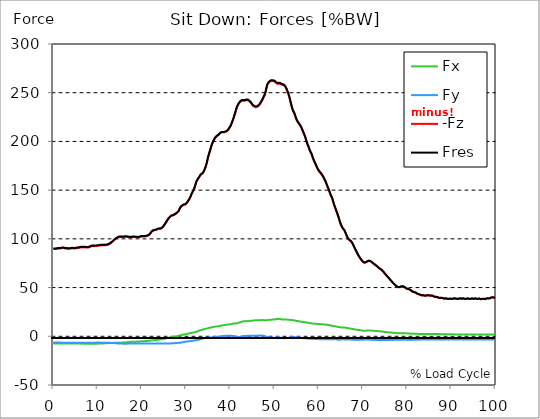
| Category |  Fx |  Fy |  -Fz |  Fres |
|---|---|---|---|---|
| 0.0 | -7.379 | -6.45 | 89.484 | 90.032 |
| 0.167348456675344 | -7.395 | -6.447 | 89.5 | 90.05 |
| 0.334696913350688 | -7.417 | -6.444 | 89.541 | 90.093 |
| 0.5020453700260321 | -7.413 | -6.454 | 89.602 | 90.153 |
| 0.669393826701376 | -7.375 | -6.476 | 89.627 | 90.177 |
| 0.83674228337672 | -7.375 | -6.463 | 89.794 | 90.341 |
| 1.0040907400520642 | -7.398 | -6.44 | 90.047 | 90.593 |
| 1.1621420602454444 | -7.417 | -6.447 | 90.121 | 90.668 |
| 1.3294905169207885 | -7.434 | -6.459 | 90.168 | 90.718 |
| 1.4968389735961325 | -7.412 | -6.487 | 90.153 | 90.704 |
| 1.6641874302714765 | -7.404 | -6.516 | 90.204 | 90.755 |
| 1.8315358869468206 | -7.42 | -6.537 | 90.339 | 90.894 |
| 1.9988843436221646 | -7.459 | -6.546 | 90.487 | 91.043 |
| 2.1662328002975086 | -7.471 | -6.546 | 90.535 | 91.093 |
| 2.333581256972853 | -7.472 | -6.556 | 90.541 | 91.099 |
| 2.5009297136481967 | -7.513 | -6.55 | 90.437 | 90.997 |
| 2.6682781703235405 | -7.469 | -6.583 | 90.109 | 90.67 |
| 2.8356266269988843 | -7.404 | -6.563 | 90.09 | 90.645 |
| 3.002975083674229 | -7.412 | -6.534 | 90.072 | 90.625 |
| 3.1703235403495724 | -7.416 | -6.546 | 89.855 | 90.412 |
| 3.337671997024917 | -7.341 | -6.555 | 89.761 | 90.313 |
| 3.4957233172182973 | -7.307 | -6.552 | 89.792 | 90.339 |
| 3.663071773893641 | -7.299 | -6.544 | 89.86 | 90.406 |
| 3.8304202305689854 | -7.304 | -6.54 | 89.978 | 90.524 |
| 3.997768687244329 | -7.348 | -6.54 | 90.205 | 90.752 |
| 4.165117143919673 | -7.417 | -6.54 | 90.24 | 90.792 |
| 4.332465600595017 | -7.419 | -6.571 | 90.252 | 90.807 |
| 4.499814057270361 | -7.442 | -6.578 | 90.277 | 90.833 |
| 4.667162513945706 | -7.442 | -6.583 | 90.119 | 90.678 |
| 4.834510970621049 | -7.401 | -6.597 | 89.976 | 90.534 |
| 5.001859427296393 | -7.375 | -6.584 | 90.155 | 90.708 |
| 5.169207883971737 | -7.426 | -6.547 | 90.428 | 90.979 |
| 5.336556340647081 | -7.481 | -6.538 | 90.6 | 91.156 |
| 5.503904797322425 | -7.541 | -6.568 | 90.63 | 91.192 |
| 5.671253253997769 | -7.501 | -6.583 | 90.667 | 91.226 |
| 5.82930457419115 | -7.494 | -6.586 | 90.838 | 91.395 |
| 5.996653030866494 | -7.519 | -6.583 | 91.06 | 91.618 |
| 6.164001487541838 | -7.55 | -6.572 | 91.251 | 91.81 |
| 6.331349944217181 | -7.575 | -6.572 | 91.353 | 91.913 |
| 6.498698400892526 | -7.553 | -6.596 | 91.317 | 91.878 |
| 6.66604685756787 | -7.488 | -6.643 | 91.158 | 91.718 |
| 6.833395314243213 | -7.457 | -6.642 | 91.326 | 91.882 |
| 7.000743770918558 | -7.575 | -6.628 | 91.412 | 91.976 |
| 7.168092227593902 | -7.615 | -6.621 | 91.24 | 91.808 |
| 7.335440684269246 | -7.6 | -6.619 | 91.078 | 91.647 |
| 7.50278914094459 | -7.547 | -6.611 | 90.984 | 91.547 |
| 7.6701375976199335 | -7.574 | -6.584 | 90.999 | 91.56 |
| 7.837486054295278 | -7.591 | -6.606 | 91.052 | 91.617 |
| 7.995537374488658 | -7.609 | -6.614 | 91.264 | 91.83 |
| 8.162885831164003 | -7.714 | -6.59 | 91.594 | 92.165 |
| 8.330234287839346 | -7.729 | -6.587 | 91.844 | 92.414 |
| 8.49758274451469 | -7.718 | -6.569 | 92.087 | 92.655 |
| 8.664931201190035 | -7.701 | -6.529 | 92.574 | 93.134 |
| 8.832279657865378 | -7.676 | -6.529 | 92.658 | 93.214 |
| 8.999628114540721 | -7.59 | -6.519 | 92.678 | 93.229 |
| 9.166976571216066 | -7.643 | -6.509 | 92.774 | 93.327 |
| 9.334325027891412 | -7.606 | -6.516 | 92.656 | 93.208 |
| 9.501673484566755 | -7.553 | -6.515 | 92.659 | 93.206 |
| 9.669021941242098 | -7.531 | -6.509 | 92.739 | 93.285 |
| 9.836370397917442 | -7.628 | -6.454 | 93.004 | 93.553 |
| 10.003718854592787 | -7.569 | -6.484 | 92.82 | 93.367 |
| 10.17106731126813 | -7.519 | -6.471 | 92.92 | 93.463 |
| 10.329118631461512 | -7.497 | -6.473 | 93.072 | 93.612 |
| 10.496467088136853 | -7.549 | -6.485 | 93.274 | 93.82 |
| 10.663815544812199 | -7.485 | -6.525 | 93.298 | 93.842 |
| 10.831164001487544 | -7.493 | -6.56 | 93.469 | 94.016 |
| 10.998512458162887 | -7.506 | -6.577 | 93.524 | 94.074 |
| 11.16586091483823 | -7.412 | -6.581 | 93.552 | 94.093 |
| 11.333209371513574 | -7.338 | -6.594 | 93.429 | 93.968 |
| 11.50055782818892 | -7.214 | -6.593 | 93.422 | 93.953 |
| 11.667906284864264 | -7.136 | -6.591 | 93.426 | 93.951 |
| 11.835254741539607 | -7.068 | -6.6 | 93.407 | 93.928 |
| 12.00260319821495 | -7.058 | -6.622 | 93.622 | 94.146 |
| 12.169951654890292 | -6.996 | -6.656 | 93.752 | 94.271 |
| 12.337300111565641 | -7.049 | -6.671 | 94.016 | 94.54 |
| 12.504648568240984 | -6.941 | -6.709 | 94.137 | 94.656 |
| 12.662699888434362 | -6.909 | -6.737 | 94.591 | 95.109 |
| 12.830048345109708 | -6.873 | -6.774 | 95.115 | 95.633 |
| 12.997396801785053 | -6.801 | -6.795 | 95.795 | 96.308 |
| 13.164745258460396 | -6.798 | -6.801 | 96.435 | 96.948 |
| 13.33209371513574 | -6.761 | -6.847 | 96.898 | 97.413 |
| 13.499442171811083 | -6.749 | -6.891 | 97.558 | 98.074 |
| 13.666790628486426 | -6.786 | -6.94 | 98.419 | 98.94 |
| 13.834139085161771 | -6.763 | -7.003 | 99.14 | 99.662 |
| 14.001487541837117 | -6.723 | -7.037 | 99.699 | 100.221 |
| 14.16883599851246 | -6.715 | -7.114 | 100.147 | 100.671 |
| 14.336184455187803 | -6.68 | -7.235 | 100.509 | 101.034 |
| 14.503532911863147 | -6.646 | -7.344 | 101.016 | 101.543 |
| 14.670881368538492 | -6.608 | -7.445 | 101.558 | 102.087 |
| 14.828932688731873 | -6.58 | -7.472 | 101.853 | 102.381 |
| 14.996281145407215 | -6.544 | -7.497 | 101.872 | 102.398 |
| 15.163629602082558 | -6.485 | -7.496 | 101.87 | 102.392 |
| 15.330978058757903 | -6.538 | -7.494 | 101.948 | 102.475 |
| 15.498326515433247 | -6.531 | -7.5 | 101.944 | 102.472 |
| 15.665674972108594 | -6.465 | -7.531 | 101.907 | 102.434 |
| 15.833023428783937 | -6.4 | -7.568 | 101.914 | 102.44 |
| 16.00037188545928 | -6.322 | -7.581 | 101.928 | 102.448 |
| 16.167720342134626 | -6.295 | -7.597 | 102.119 | 102.639 |
| 16.335068798809967 | -6.302 | -7.577 | 102.273 | 102.789 |
| 16.502417255485312 | -6.198 | -7.563 | 102.187 | 102.696 |
| 16.669765712160658 | -6.078 | -7.541 | 102.058 | 102.558 |
| 16.837114168836 | -5.938 | -7.501 | 101.861 | 102.353 |
| 17.004462625511344 | -5.851 | -7.476 | 101.704 | 102.189 |
| 17.16251394570472 | -5.767 | -7.451 | 101.566 | 102.047 |
| 17.32986240238007 | -5.696 | -7.406 | 101.69 | 102.165 |
| 17.497210859055414 | -5.661 | -7.385 | 101.686 | 102.161 |
| 17.664559315730756 | -5.619 | -7.386 | 101.674 | 102.146 |
| 17.8319077724061 | -5.649 | -7.388 | 101.866 | 102.341 |
| 17.999256229081443 | -5.624 | -7.383 | 101.934 | 102.407 |
| 18.166604685756788 | -5.597 | -7.363 | 101.932 | 102.404 |
| 18.333953142432133 | -5.522 | -7.369 | 101.867 | 102.336 |
| 18.501301599107478 | -5.482 | -7.391 | 101.881 | 102.348 |
| 18.668650055782823 | -5.504 | -7.373 | 101.779 | 102.249 |
| 18.835998512458165 | -5.442 | -7.392 | 101.571 | 102.04 |
| 19.00334696913351 | -5.42 | -7.385 | 101.518 | 101.985 |
| 19.170695425808855 | -5.4 | -7.375 | 101.482 | 101.948 |
| 19.338043882484197 | -5.333 | -7.336 | 101.647 | 102.108 |
| 19.496095202677576 | -5.302 | -7.294 | 101.912 | 102.367 |
| 19.66344365935292 | -5.268 | -7.285 | 102.145 | 102.599 |
| 19.830792116028263 | -5.18 | -7.363 | 102.195 | 102.649 |
| 19.998140572703612 | -5.159 | -7.397 | 102.401 | 102.854 |
| 20.165489029378953 | -5.124 | -7.381 | 102.558 | 103.009 |
| 20.3328374860543 | -5.093 | -7.369 | 102.524 | 102.972 |
| 20.500185942729644 | -5.034 | -7.355 | 102.471 | 102.916 |
| 20.667534399404985 | -4.941 | -7.336 | 102.504 | 102.942 |
| 20.83488285608033 | -4.863 | -7.33 | 102.751 | 103.186 |
| 21.002231312755672 | -4.82 | -7.335 | 102.742 | 103.177 |
| 21.16957976943102 | -4.73 | -7.32 | 102.944 | 103.372 |
| 21.336928226106362 | -4.696 | -7.298 | 103.199 | 103.624 |
| 21.504276682781704 | -4.647 | -7.292 | 103.471 | 103.892 |
| 21.67162513945705 | -4.58 | -7.311 | 104.068 | 104.485 |
| 21.82967645965043 | -4.512 | -7.32 | 104.82 | 105.233 |
| 21.997024916325774 | -4.416 | -7.406 | 105.92 | 106.33 |
| 22.16437337300112 | -4.324 | -7.481 | 106.996 | 107.404 |
| 22.33172182967646 | -4.211 | -7.49 | 107.807 | 108.211 |
| 22.499070286351806 | -4.103 | -7.459 | 108.296 | 108.695 |
| 22.666418743027148 | -4.003 | -7.447 | 108.683 | 109.075 |
| 22.833767199702496 | -3.947 | -7.462 | 108.91 | 109.299 |
| 23.00111565637784 | -3.903 | -7.463 | 108.999 | 109.383 |
| 23.168464113053183 | -3.805 | -7.471 | 109.024 | 109.403 |
| 23.335812569728528 | -3.726 | -7.468 | 109.382 | 109.757 |
| 23.50316102640387 | -3.611 | -7.453 | 109.9 | 110.268 |
| 23.670509483079215 | -3.507 | -7.434 | 110.183 | 110.546 |
| 23.83785793975456 | -3.403 | -7.426 | 110.332 | 110.689 |
| 23.995909259947936 | -3.314 | -7.389 | 110.329 | 110.677 |
| 24.163257716623285 | -3.252 | -7.31 | 110.279 | 110.618 |
| 24.330606173298627 | -3.177 | -7.283 | 110.531 | 110.866 |
| 24.49795462997397 | -3.077 | -7.248 | 110.991 | 111.322 |
| 24.665303086649313 | -3 | -7.301 | 111.662 | 111.993 |
| 24.83265154332466 | -2.875 | -7.344 | 112.494 | 112.824 |
| 25.0 | -2.714 | -7.361 | 113.388 | 113.714 |
| 25.167348456675345 | -2.5 | -7.332 | 114.578 | 114.901 |
| 25.334696913350694 | -2.264 | -7.28 | 115.894 | 116.214 |
| 25.502045370026035 | -2.118 | -7.348 | 117.09 | 117.412 |
| 25.669393826701377 | -1.882 | -7.41 | 118.149 | 118.472 |
| 25.836742283376722 | -1.64 | -7.329 | 119.45 | 119.773 |
| 26.004090740052067 | -1.487 | -7.329 | 120.59 | 120.914 |
| 26.17143919672741 | -1.383 | -7.388 | 121.478 | 121.804 |
| 26.329490516920792 | -1.229 | -7.382 | 122.237 | 122.56 |
| 26.49683897359613 | -1.04 | -7.324 | 123.016 | 123.335 |
| 26.66418743027148 | -0.882 | -7.257 | 123.735 | 124.052 |
| 26.831535886946828 | -0.796 | -7.257 | 123.879 | 124.192 |
| 26.998884343622166 | -0.678 | -7.214 | 123.991 | 124.295 |
| 27.166232800297514 | -0.553 | -7.17 | 124.131 | 124.428 |
| 27.333581256972852 | -0.37 | -7.066 | 124.69 | 124.981 |
| 27.5009297136482 | -0.237 | -7.022 | 125.226 | 125.512 |
| 27.668278170323543 | -0.122 | -6.987 | 125.783 | 126.065 |
| 27.835626626998888 | -0.025 | -6.984 | 126.357 | 126.636 |
| 28.002975083674233 | 0.114 | -6.854 | 126.897 | 127.167 |
| 28.170323540349575 | 0.273 | -6.757 | 127.568 | 127.83 |
| 28.33767199702492 | 0.45 | -6.636 | 128.524 | 128.779 |
| 28.50502045370026 | 0.723 | -6.627 | 130.237 | 130.496 |
| 28.663071773893645 | 0.987 | -6.68 | 131.671 | 131.937 |
| 28.830420230568986 | 1.212 | -6.528 | 132.78 | 133.046 |
| 28.99776868724433 | 1.397 | -6.323 | 133.676 | 133.938 |
| 29.165117143919673 | 1.518 | -6.17 | 134.218 | 134.475 |
| 29.33246560059502 | 1.639 | -6.018 | 134.74 | 134.99 |
| 29.499814057270367 | 1.761 | -5.894 | 135.035 | 135.282 |
| 29.66716251394571 | 1.907 | -5.765 | 135.14 | 135.382 |
| 29.834510970621054 | 2.074 | -5.59 | 135.358 | 135.593 |
| 30.00185942729639 | 2.211 | -5.469 | 136.028 | 136.257 |
| 30.169207883971744 | 2.364 | -5.373 | 136.889 | 137.118 |
| 30.33655634064708 | 2.543 | -5.322 | 137.935 | 138.164 |
| 30.50390479732243 | 2.714 | -5.245 | 138.956 | 139.183 |
| 30.671253253997772 | 2.863 | -5.174 | 140.242 | 140.468 |
| 30.829304574191156 | 3.078 | -5.01 | 141.55 | 141.771 |
| 30.996653030866494 | 3.243 | -4.829 | 143.133 | 143.35 |
| 31.164001487541842 | 3.339 | -4.757 | 144.997 | 145.212 |
| 31.331349944217187 | 3.487 | -4.673 | 146.757 | 146.968 |
| 31.498698400892525 | 3.678 | -4.6 | 148.354 | 148.56 |
| 31.666046857567874 | 3.822 | -4.438 | 149.702 | 149.9 |
| 31.833395314243212 | 3.984 | -4.292 | 151.307 | 151.497 |
| 32.00074377091856 | 4.201 | -4.202 | 153.599 | 153.789 |
| 32.1680922275939 | 4.451 | -4.124 | 156.233 | 156.429 |
| 32.33544068426925 | 4.698 | -3.991 | 158.547 | 158.748 |
| 32.50278914094459 | 4.942 | -3.82 | 160.075 | 160.273 |
| 32.670137597619934 | 5.248 | -3.681 | 161.271 | 161.468 |
| 32.83748605429528 | 5.586 | -3.611 | 162.487 | 162.686 |
| 33.004834510970625 | 5.854 | -3.319 | 163.668 | 163.861 |
| 33.162885831164004 | 6.112 | -2.99 | 164.844 | 165.031 |
| 33.33023428783935 | 6.397 | -2.827 | 166.088 | 166.277 |
| 33.497582744514695 | 6.593 | -2.628 | 166.566 | 166.761 |
| 33.664931201190036 | 6.767 | -2.4 | 166.968 | 167.165 |
| 33.83227965786538 | 6.968 | -2.195 | 167.636 | 167.841 |
| 33.99962811454073 | 7.187 | -2.122 | 168.966 | 169.183 |
| 34.16697657121607 | 7.369 | -2.006 | 170.82 | 171.043 |
| 34.33432502789141 | 7.562 | -1.807 | 172.678 | 172.903 |
| 34.50167348456676 | 7.736 | -1.658 | 174.894 | 175.119 |
| 34.6690219412421 | 7.886 | -1.546 | 177.497 | 177.726 |
| 34.83637039791744 | 8.096 | -1.438 | 180.777 | 181.013 |
| 35.00371885459279 | 8.363 | -1.367 | 184.112 | 184.357 |
| 35.17106731126814 | 8.577 | -1.282 | 186.705 | 186.953 |
| 35.338415767943474 | 8.739 | -1.211 | 189.152 | 189.404 |
| 35.49646708813686 | 8.909 | -1.198 | 191.667 | 191.925 |
| 35.6638155448122 | 9.086 | -1.223 | 194.209 | 194.473 |
| 35.831164001487544 | 9.187 | -1.205 | 196.56 | 196.826 |
| 35.998512458162885 | 9.355 | -1.17 | 198.469 | 198.743 |
| 36.165860914838234 | 9.537 | -1.075 | 200.206 | 200.487 |
| 36.333209371513576 | 9.692 | -1.021 | 201.748 | 202.035 |
| 36.50055782818892 | 9.888 | -0.916 | 203.086 | 203.383 |
| 36.667906284864266 | 9.979 | -0.795 | 204.168 | 204.471 |
| 36.83525474153961 | 10.058 | -0.661 | 205.131 | 205.437 |
| 37.002603198214956 | 10.161 | -0.544 | 205.646 | 205.959 |
| 37.1699516548903 | 10.285 | -0.447 | 206.024 | 206.344 |
| 37.337300111565646 | 10.394 | -0.354 | 206.63 | 206.956 |
| 37.50464856824098 | 10.529 | -0.252 | 207.466 | 207.799 |
| 37.66269988843437 | 10.693 | -0.128 | 208.332 | 208.676 |
| 37.83004834510971 | 10.86 | -0.007 | 208.954 | 209.31 |
| 37.99739680178505 | 11.027 | 0.112 | 209.295 | 209.662 |
| 38.16474525846039 | 11.177 | 0.221 | 209.341 | 209.72 |
| 38.33209371513574 | 11.313 | 0.258 | 209.327 | 209.717 |
| 38.49944217181109 | 11.448 | 0.296 | 209.314 | 209.714 |
| 38.666790628486424 | 11.556 | 0.333 | 209.538 | 209.947 |
| 38.83413908516178 | 11.665 | 0.406 | 209.706 | 210.124 |
| 39.001487541837115 | 11.779 | 0.471 | 209.938 | 210.366 |
| 39.16883599851246 | 11.907 | 0.509 | 210.367 | 210.804 |
| 39.336184455187805 | 12.032 | 0.553 | 210.829 | 211.276 |
| 39.503532911863154 | 12.112 | 0.559 | 211.627 | 212.081 |
| 39.670881368538495 | 12.174 | 0.531 | 212.749 | 213.208 |
| 39.83822982521384 | 12.263 | 0.56 | 213.94 | 214.406 |
| 39.996281145407224 | 12.341 | 0.558 | 215.176 | 215.647 |
| 40.163629602082565 | 12.45 | 0.519 | 216.674 | 217.153 |
| 40.33097805875791 | 12.615 | 0.414 | 218.664 | 219.153 |
| 40.498326515433256 | 12.829 | 0.423 | 220.668 | 221.168 |
| 40.6656749721086 | 13.043 | 0.33 | 222.625 | 223.136 |
| 40.83302342878393 | 13.078 | 0.176 | 225.052 | 225.562 |
| 41.00037188545929 | 13.13 | -0.012 | 227.412 | 227.923 |
| 41.16772034213463 | 13.176 | -0.26 | 229.934 | 230.45 |
| 41.33506879880997 | 13.233 | -0.528 | 232.555 | 233.075 |
| 41.50241725548531 | 13.397 | -0.758 | 235.074 | 235.602 |
| 41.66976571216066 | 13.518 | -0.822 | 236.81 | 237.342 |
| 41.837114168836 | 13.785 | -0.782 | 238.081 | 238.634 |
| 42.004462625511344 | 14.068 | -0.761 | 239.274 | 239.85 |
| 42.17181108218669 | 14.372 | -0.684 | 240.243 | 240.844 |
| 42.32986240238007 | 14.656 | -0.529 | 241.087 | 241.711 |
| 42.497210859055414 | 14.842 | -0.279 | 241.633 | 242.27 |
| 42.66455931573076 | 14.988 | -0.049 | 241.895 | 242.552 |
| 42.831907772406105 | 15.26 | 0.038 | 242.013 | 242.704 |
| 42.999256229081446 | 15.391 | 0.265 | 241.78 | 242.488 |
| 43.16660468575679 | 15.447 | 0.434 | 241.671 | 242.386 |
| 43.33395314243214 | 15.499 | 0.383 | 241.855 | 242.574 |
| 43.50130159910748 | 15.512 | 0.403 | 242.168 | 242.881 |
| 43.66865005578282 | 15.522 | 0.406 | 242.414 | 243.124 |
| 43.83599851245817 | 15.556 | 0.406 | 242.45 | 243.161 |
| 44.00334696913351 | 15.659 | 0.482 | 242.204 | 242.925 |
| 44.17069542580886 | 15.804 | 0.587 | 241.687 | 242.42 |
| 44.3380438824842 | 15.909 | 0.543 | 241 | 241.737 |
| 44.49609520267758 | 15.844 | 0.5 | 240.289 | 241.015 |
| 44.66344365935292 | 15.748 | 0.473 | 239.524 | 240.239 |
| 44.83079211602827 | 15.878 | 0.41 | 238.521 | 239.252 |
| 44.99814057270361 | 16.024 | 0.522 | 237.347 | 238.088 |
| 45.16548902937895 | 16.117 | 0.619 | 236.442 | 237.19 |
| 45.332837486054295 | 16.195 | 0.667 | 235.86 | 236.615 |
| 45.500185942729644 | 16.338 | 0.593 | 235.413 | 236.181 |
| 45.66753439940499 | 16.4 | 0.507 | 235.178 | 235.953 |
| 45.83488285608033 | 16.394 | 0.531 | 235.156 | 235.934 |
| 46.00223131275568 | 16.372 | 0.611 | 235.317 | 236.096 |
| 46.16957976943102 | 16.398 | 0.699 | 235.702 | 236.484 |
| 46.336928226106366 | 16.488 | 0.776 | 236.229 | 237.019 |
| 46.50427668278171 | 16.562 | 0.853 | 236.901 | 237.701 |
| 46.671625139457056 | 16.5 | 0.802 | 237.866 | 238.656 |
| 46.829676459650436 | 16.544 | 0.794 | 239.09 | 239.879 |
| 46.99702491632577 | 16.609 | 0.789 | 240.366 | 241.158 |
| 47.16437337300112 | 16.718 | 0.763 | 241.792 | 242.587 |
| 47.33172182967646 | 16.643 | 0.659 | 243.142 | 243.919 |
| 47.49907028635181 | 16.558 | 0.485 | 244.857 | 245.615 |
| 47.66641874302716 | 16.515 | 0.323 | 246.512 | 247.26 |
| 47.83376719970249 | 16.491 | 0.24 | 248.134 | 248.873 |
| 48.001115656377834 | 16.465 | -0.072 | 250.776 | 251.507 |
| 48.16846411305319 | 16.437 | -0.488 | 254.223 | 254.944 |
| 48.33581256972853 | 16.553 | -0.776 | 257.361 | 258.084 |
| 48.50316102640387 | 16.705 | -0.951 | 259.003 | 259.729 |
| 48.67050948307921 | 16.763 | -1.041 | 260.125 | 260.851 |
| 48.837857939754564 | 16.844 | -1.097 | 261.025 | 261.755 |
| 49.005206396429905 | 16.959 | -1.153 | 261.544 | 262.277 |
| 49.163257716623285 | 16.997 | -1.263 | 261.928 | 262.665 |
| 49.33060617329863 | 17.062 | -1.392 | 262.167 | 262.912 |
| 49.49795462997397 | 17.156 | -1.531 | 262.236 | 262.991 |
| 49.66530308664932 | 17.255 | -1.614 | 262.038 | 262.801 |
| 49.832651543324666 | 17.251 | -1.693 | 261.857 | 262.618 |
| 50.0 | 17.229 | -1.702 | 261.584 | 262.344 |
| 50.16734845667534 | 17.434 | -1.465 | 260.976 | 261.749 |
| 50.33469691335069 | 17.584 | -1.317 | 260.221 | 261.006 |
| 50.50204537002604 | 17.736 | -1.168 | 259.468 | 260.263 |
| 50.66939382670139 | 17.814 | -0.971 | 259.117 | 259.914 |
| 50.836742283376715 | 17.798 | -1.058 | 259.24 | 260.034 |
| 51.00409074005207 | 17.779 | -1.153 | 259.378 | 260.168 |
| 51.17143919672741 | 17.749 | -1.314 | 259.407 | 260.195 |
| 51.32949051692079 | 17.608 | -1.4 | 259.111 | 259.889 |
| 51.496838973596134 | 17.22 | -1.403 | 258.774 | 259.525 |
| 51.66418743027148 | 17.336 | -1.74 | 258.26 | 259.022 |
| 51.831535886946824 | 17.373 | -1.965 | 257.935 | 258.705 |
| 51.99888434362217 | 17.289 | -1.953 | 257.805 | 258.568 |
| 52.16623280029752 | 17.206 | -1.922 | 257.659 | 258.416 |
| 52.33358125697285 | 17.177 | -1.954 | 256.739 | 257.496 |
| 52.5009297136482 | 17.13 | -1.941 | 255.501 | 256.258 |
| 52.668278170323546 | 17.136 | -1.826 | 254.012 | 254.771 |
| 52.835626626998895 | 17.133 | -1.752 | 252.192 | 252.953 |
| 53.00297508367424 | 17.091 | -1.687 | 250.237 | 251 |
| 53.17032354034958 | 17.016 | -1.631 | 248.112 | 248.875 |
| 53.33767199702492 | 16.947 | -1.503 | 245.624 | 246.388 |
| 53.50502045370027 | 16.894 | -1.246 | 242.714 | 243.476 |
| 53.663071773893655 | 16.742 | -1.055 | 239.375 | 240.128 |
| 53.83042023056899 | 16.586 | -0.962 | 236.441 | 237.186 |
| 53.99776868724433 | 16.586 | -0.751 | 233.718 | 234.468 |
| 54.16511714391967 | 16.583 | -0.634 | 231.482 | 232.239 |
| 54.33246560059503 | 16.471 | -0.732 | 229.942 | 230.696 |
| 54.49981405727037 | 16.27 | -0.82 | 228.484 | 229.226 |
| 54.667162513945705 | 16.063 | -0.878 | 226.145 | 226.878 |
| 54.834510970621054 | 15.866 | -0.941 | 223.823 | 224.547 |
| 55.0018594272964 | 15.767 | -1.055 | 221.91 | 222.63 |
| 55.169207883971744 | 15.736 | -1.094 | 220.397 | 221.117 |
| 55.336556340647086 | 15.617 | -1.183 | 219.212 | 219.923 |
| 55.50390479732243 | 15.448 | -1.267 | 218.171 | 218.867 |
| 55.671253253997776 | 15.279 | -1.35 | 217.131 | 217.811 |
| 55.83860171067312 | 15.118 | -1.444 | 215.944 | 216.611 |
| 55.9966530308665 | 14.965 | -1.555 | 214.574 | 215.232 |
| 56.16400148754184 | 14.836 | -1.661 | 213.055 | 213.705 |
| 56.33134994421718 | 14.733 | -1.749 | 211.196 | 211.847 |
| 56.498698400892536 | 14.642 | -1.826 | 209.224 | 209.872 |
| 56.66604685756788 | 14.565 | -1.982 | 207.509 | 208.155 |
| 56.83339531424321 | 14.426 | -2.084 | 205.555 | 206.199 |
| 57.00074377091856 | 14.283 | -2.195 | 203.478 | 204.118 |
| 57.16809222759391 | 14.164 | -2.248 | 200.875 | 201.515 |
| 57.33544068426925 | 14.047 | -2.239 | 198.354 | 198.993 |
| 57.5027891409446 | 13.926 | -2.279 | 196.139 | 196.776 |
| 57.670137597619934 | 13.827 | -2.376 | 194.571 | 195.205 |
| 57.83748605429528 | 13.637 | -2.435 | 192.401 | 193.027 |
| 58.004834510970625 | 13.445 | -2.581 | 190.296 | 190.916 |
| 58.16288583116401 | 13.392 | -2.59 | 188.586 | 189.208 |
| 58.330234287839346 | 13.332 | -2.622 | 187.299 | 187.92 |
| 58.497582744514695 | 13.227 | -2.572 | 185.311 | 185.929 |
| 58.66493120119004 | 13.081 | -2.569 | 182.898 | 183.512 |
| 58.832279657865385 | 12.981 | -2.65 | 180.963 | 181.577 |
| 58.999628114540734 | 12.903 | -2.708 | 179.205 | 179.822 |
| 59.16697657121607 | 12.827 | -2.718 | 177.453 | 178.072 |
| 59.33432502789142 | 12.788 | -2.702 | 175.854 | 176.478 |
| 59.50167348456676 | 12.714 | -2.767 | 174.125 | 174.752 |
| 59.66902194124211 | 12.636 | -2.861 | 172.332 | 172.96 |
| 59.83637039791745 | 12.593 | -2.883 | 171.001 | 171.633 |
| 60.00371885459278 | 12.516 | -2.882 | 169.729 | 170.36 |
| 60.17106731126813 | 12.481 | -2.948 | 168.673 | 169.307 |
| 60.33841576794349 | 12.462 | -2.94 | 167.801 | 168.435 |
| 60.49646708813685 | 12.442 | -2.931 | 166.929 | 167.563 |
| 60.6638155448122 | 12.419 | -2.923 | 166.034 | 166.67 |
| 60.831164001487544 | 12.348 | -2.954 | 164.783 | 165.417 |
| 60.99851245816289 | 12.276 | -2.987 | 163.531 | 164.165 |
| 61.16586091483824 | 12.193 | -3.004 | 162.075 | 162.708 |
| 61.333209371513576 | 12.103 | -3.013 | 160.488 | 161.121 |
| 61.50055782818892 | 11.968 | -2.966 | 159.08 | 159.706 |
| 61.667906284864266 | 11.847 | -3.038 | 157.078 | 157.702 |
| 61.835254741539615 | 11.754 | -3.052 | 155.22 | 155.841 |
| 62.002603198214956 | 11.76 | -3.118 | 153.103 | 153.73 |
| 62.16995165489029 | 11.63 | -3.117 | 151.413 | 152.035 |
| 62.33730011156564 | 11.456 | -3.018 | 149.423 | 150.038 |
| 62.504648568240995 | 11.251 | -2.956 | 147.296 | 147.9 |
| 62.67199702491633 | 11.125 | -2.934 | 145.065 | 145.662 |
| 62.83004834510971 | 11.056 | -3.074 | 143.451 | 144.053 |
| 62.99739680178505 | 10.78 | -2.95 | 141.971 | 142.549 |
| 63.1647452584604 | 10.56 | -2.969 | 139.569 | 140.13 |
| 63.33209371513575 | 10.512 | -2.951 | 136.917 | 137.469 |
| 63.4994421718111 | 10.453 | -2.971 | 134.41 | 134.956 |
| 63.666790628486424 | 10.361 | -3.097 | 132.322 | 132.866 |
| 63.83413908516177 | 10.261 | -3.117 | 130.322 | 130.863 |
| 64.00148754183712 | 10.1 | -3.211 | 128.153 | 128.687 |
| 64.16883599851248 | 9.857 | -3.345 | 126.177 | 126.699 |
| 64.3361844551878 | 9.58 | -3.496 | 123.932 | 124.441 |
| 64.50353291186315 | 9.388 | -3.58 | 121.645 | 122.149 |
| 64.6708813685385 | 9.301 | -3.587 | 119.195 | 119.699 |
| 64.83822982521384 | 9.254 | -3.459 | 116.588 | 117.09 |
| 65.00557828188919 | 9.159 | -3.342 | 114.608 | 115.105 |
| 65.16362960208257 | 9.055 | -3.215 | 112.854 | 113.347 |
| 65.3309780587579 | 8.96 | -3.062 | 111.363 | 111.851 |
| 65.49832651543326 | 8.96 | -3.035 | 110.149 | 110.64 |
| 65.6656749721086 | 9.05 | -3.075 | 109.184 | 109.69 |
| 65.83302342878395 | 9.14 | -3.115 | 108.218 | 108.739 |
| 66.00037188545929 | 8.886 | -3.264 | 106.522 | 107.028 |
| 66.16772034213463 | 8.683 | -3.302 | 104.627 | 105.122 |
| 66.33506879880998 | 8.521 | -3.289 | 102.801 | 103.286 |
| 66.50241725548531 | 8.404 | -3.267 | 101.097 | 101.577 |
| 66.66976571216065 | 8.336 | -3.217 | 99.717 | 100.195 |
| 66.83711416883601 | 8.084 | -3.103 | 98.982 | 99.435 |
| 67.00446262551135 | 8.047 | -3.165 | 98.397 | 98.848 |
| 67.1718110821867 | 7.95 | -3.267 | 97.882 | 98.33 |
| 67.32986240238007 | 7.832 | -3.367 | 97.198 | 97.642 |
| 67.49721085905541 | 7.678 | -3.468 | 96.211 | 96.65 |
| 67.66455931573076 | 7.515 | -3.521 | 94.85 | 95.28 |
| 67.83190777240611 | 7.322 | -3.555 | 93.296 | 93.717 |
| 67.99925622908145 | 7.149 | -3.558 | 91.633 | 92.04 |
| 68.16660468575678 | 7.01 | -3.559 | 89.985 | 90.385 |
| 68.33395314243214 | 6.888 | -3.574 | 88.431 | 88.827 |
| 68.50130159910749 | 6.789 | -3.596 | 86.987 | 87.381 |
| 68.66865005578282 | 6.693 | -3.59 | 85.445 | 85.836 |
| 68.83599851245816 | 6.602 | -3.544 | 83.999 | 84.385 |
| 69.00334696913352 | 6.494 | -3.522 | 82.622 | 83.006 |
| 69.17069542580886 | 6.357 | -3.547 | 81.36 | 81.74 |
| 69.3380438824842 | 6.258 | -3.527 | 80.237 | 80.614 |
| 69.50539233915956 | 6.136 | -3.568 | 79.23 | 79.599 |
| 69.66344365935292 | 6.003 | -3.532 | 78.119 | 78.482 |
| 69.83079211602826 | 5.863 | -3.482 | 77.159 | 77.512 |
| 69.99814057270362 | 5.74 | -3.46 | 76.335 | 76.68 |
| 70.16548902937896 | 5.653 | -3.448 | 75.699 | 76.04 |
| 70.33283748605429 | 5.64 | -3.386 | 75.447 | 75.789 |
| 70.50018594272964 | 5.636 | -3.333 | 75.274 | 75.617 |
| 70.667534399405 | 5.718 | -3.336 | 75.83 | 76.177 |
| 70.83488285608033 | 5.805 | -3.311 | 76.353 | 76.704 |
| 71.00223131275568 | 5.9 | -3.273 | 76.816 | 77.173 |
| 71.16957976943102 | 5.99 | -3.249 | 77.27 | 77.633 |
| 71.33692822610637 | 6.018 | -3.298 | 77.31 | 77.677 |
| 71.50427668278171 | 6.041 | -3.357 | 77.298 | 77.668 |
| 71.67162513945706 | 6.041 | -3.473 | 76.991 | 77.364 |
| 71.8389735961324 | 6.001 | -3.553 | 76.571 | 76.942 |
| 71.99702491632577 | 5.883 | -3.562 | 75.931 | 76.294 |
| 72.16437337300113 | 5.765 | -3.571 | 75.291 | 75.643 |
| 72.33172182967647 | 5.662 | -3.64 | 74.655 | 75.003 |
| 72.49907028635181 | 5.577 | -3.727 | 74.04 | 74.385 |
| 72.66641874302715 | 5.556 | -3.757 | 73.546 | 73.892 |
| 72.8337671997025 | 5.5 | -3.768 | 72.978 | 73.323 |
| 73.00111565637783 | 5.444 | -3.78 | 72.407 | 72.749 |
| 73.16846411305319 | 5.4 | -3.763 | 71.786 | 72.127 |
| 73.33581256972853 | 5.338 | -3.745 | 71.084 | 71.422 |
| 73.50316102640387 | 5.223 | -3.764 | 70.27 | 70.602 |
| 73.67050948307921 | 5.161 | -3.751 | 69.631 | 69.96 |
| 73.83785793975457 | 5.125 | -3.729 | 69.119 | 69.447 |
| 74.00520639642991 | 5.034 | -3.788 | 68.77 | 69.093 |
| 74.16325771662328 | 4.994 | -3.774 | 68.193 | 68.515 |
| 74.33060617329863 | 4.922 | -3.782 | 67.476 | 67.796 |
| 74.49795462997398 | 4.839 | -3.814 | 66.704 | 67.019 |
| 74.66530308664932 | 4.739 | -3.829 | 65.827 | 66.14 |
| 74.83265154332466 | 4.593 | -3.873 | 64.891 | 65.198 |
| 75.00000000000001 | 4.44 | -3.838 | 63.988 | 64.285 |
| 75.16734845667534 | 4.35 | -3.82 | 63.05 | 63.344 |
| 75.3346969133507 | 4.273 | -3.83 | 62.211 | 62.5 |
| 75.50204537002605 | 4.189 | -3.838 | 61.375 | 61.661 |
| 75.66939382670138 | 4.146 | -3.813 | 60.572 | 60.858 |
| 75.83674228337672 | 4.05 | -3.813 | 59.74 | 60.021 |
| 76.00409074005208 | 3.929 | -3.813 | 58.796 | 59.071 |
| 76.17143919672742 | 3.861 | -3.799 | 57.816 | 58.088 |
| 76.33878765340276 | 3.842 | -3.764 | 57.018 | 57.291 |
| 76.49683897359614 | 3.771 | -3.746 | 56.146 | 56.416 |
| 76.66418743027148 | 3.706 | -3.723 | 55.282 | 55.55 |
| 76.83153588694682 | 3.64 | -3.701 | 54.457 | 54.721 |
| 76.99888434362218 | 3.55 | -3.687 | 53.757 | 54.016 |
| 77.16623280029752 | 3.451 | -3.667 | 53.056 | 53.31 |
| 77.33358125697285 | 3.381 | -3.631 | 52.237 | 52.488 |
| 77.5009297136482 | 3.311 | -3.615 | 51.614 | 51.86 |
| 77.66827817032356 | 3.243 | -3.597 | 50.991 | 51.233 |
| 77.83562662699889 | 3.171 | -3.581 | 50.487 | 50.726 |
| 78.00297508367423 | 3.111 | -3.612 | 50.258 | 50.496 |
| 78.17032354034959 | 3.088 | -3.631 | 50.183 | 50.42 |
| 78.33767199702493 | 3.119 | -3.634 | 50.26 | 50.499 |
| 78.50502045370027 | 3.201 | -3.662 | 50.805 | 51.05 |
| 78.67236891037561 | 3.236 | -3.662 | 51.14 | 51.386 |
| 78.83042023056899 | 3.249 | -3.652 | 51.19 | 51.437 |
| 78.99776868724433 | 3.242 | -3.653 | 51.091 | 51.338 |
| 79.16511714391969 | 3.22 | -3.662 | 50.895 | 51.143 |
| 79.33246560059503 | 3.199 | -3.671 | 50.701 | 50.947 |
| 79.49981405727036 | 3.127 | -3.658 | 50.152 | 50.395 |
| 79.66716251394571 | 3.056 | -3.64 | 49.46 | 49.701 |
| 79.83451097062107 | 2.994 | -3.633 | 48.878 | 49.117 |
| 80.00185942729641 | 2.972 | -3.65 | 48.529 | 48.77 |
| 80.16920788397174 | 2.954 | -3.686 | 48.485 | 48.729 |
| 80.33655634064709 | 2.906 | -3.687 | 48.348 | 48.588 |
| 80.50390479732243 | 2.833 | -3.671 | 47.976 | 48.212 |
| 80.67125325399778 | 2.796 | -3.699 | 47.633 | 47.87 |
| 80.83860171067312 | 2.735 | -3.683 | 47.027 | 47.263 |
| 80.99665303086651 | 2.674 | -3.668 | 46.46 | 46.695 |
| 81.16400148754184 | 2.633 | -3.631 | 45.814 | 46.047 |
| 81.3313499442172 | 2.624 | -3.605 | 45.434 | 45.665 |
| 81.49869840089255 | 2.622 | -3.597 | 45.361 | 45.593 |
| 81.66604685756786 | 2.605 | -3.575 | 45.075 | 45.307 |
| 81.83339531424322 | 2.594 | -3.565 | 44.956 | 45.186 |
| 82.00074377091858 | 2.555 | -3.534 | 44.562 | 44.789 |
| 82.16809222759392 | 2.507 | -3.504 | 44.012 | 44.236 |
| 82.33544068426926 | 2.493 | -3.479 | 43.442 | 43.665 |
| 82.50278914094459 | 2.463 | -3.466 | 43.08 | 43.302 |
| 82.67013759761994 | 2.457 | -3.456 | 43.035 | 43.257 |
| 82.83748605429528 | 2.414 | -3.426 | 42.755 | 42.973 |
| 83.00483451097062 | 2.394 | -3.391 | 42.388 | 42.605 |
| 83.17218296764597 | 2.391 | -3.391 | 42.075 | 42.294 |
| 83.33023428783935 | 2.394 | -3.391 | 41.898 | 42.117 |
| 83.4975827445147 | 2.397 | -3.395 | 42.027 | 42.245 |
| 83.66493120119004 | 2.388 | -3.363 | 42.038 | 42.254 |
| 83.83227965786537 | 2.335 | -3.322 | 41.745 | 41.957 |
| 83.99962811454073 | 2.335 | -3.283 | 41.51 | 41.721 |
| 84.16697657121607 | 2.339 | -3.255 | 41.473 | 41.681 |
| 84.33432502789142 | 2.344 | -3.245 | 41.662 | 41.867 |
| 84.50167348456677 | 2.347 | -3.251 | 41.997 | 42.202 |
| 84.6690219412421 | 2.344 | -3.251 | 42.118 | 42.324 |
| 84.83637039791745 | 2.341 | -3.26 | 42.05 | 42.258 |
| 85.0037188545928 | 2.286 | -3.258 | 41.774 | 41.981 |
| 85.17106731126813 | 2.286 | -3.264 | 41.668 | 41.875 |
| 85.33841576794349 | 2.317 | -3.232 | 41.627 | 41.833 |
| 85.50576422461883 | 2.327 | -3.265 | 41.917 | 42.124 |
| 85.66381554481221 | 2.316 | -3.258 | 41.702 | 41.909 |
| 85.83116400148755 | 2.301 | -3.243 | 41.198 | 41.404 |
| 85.99851245816289 | 2.322 | -3.218 | 40.827 | 41.035 |
| 86.16586091483823 | 2.345 | -3.193 | 40.556 | 40.763 |
| 86.33320937151358 | 2.355 | -3.19 | 40.426 | 40.634 |
| 86.50055782818893 | 2.357 | -3.218 | 40.546 | 40.755 |
| 86.66790628486427 | 2.32 | -3.215 | 40.409 | 40.618 |
| 86.83525474153961 | 2.248 | -3.223 | 40.034 | 40.242 |
| 87.00260319821496 | 2.221 | -3.23 | 39.647 | 39.857 |
| 87.16995165489031 | 2.23 | -3.212 | 39.37 | 39.581 |
| 87.33730011156564 | 2.24 | -3.195 | 39.198 | 39.409 |
| 87.504648568241 | 2.214 | -3.215 | 39.301 | 39.512 |
| 87.67199702491634 | 2.187 | -3.218 | 39.389 | 39.597 |
| 87.83004834510972 | 2.165 | -3.215 | 39.45 | 39.658 |
| 87.99739680178506 | 2.162 | -3.229 | 39.201 | 39.412 |
| 88.1647452584604 | 2.152 | -3.24 | 38.808 | 39.022 |
| 88.33209371513574 | 2.155 | -3.26 | 38.537 | 38.752 |
| 88.49944217181108 | 2.202 | -3.249 | 38.615 | 38.83 |
| 88.66679062848644 | 2.208 | -3.264 | 38.851 | 39.068 |
| 88.83413908516178 | 2.161 | -3.28 | 38.878 | 39.094 |
| 89.00148754183712 | 2.109 | -3.265 | 38.401 | 38.617 |
| 89.16883599851246 | 2.124 | -3.252 | 38.056 | 38.273 |
| 89.33618445518782 | 2.142 | -3.268 | 38.142 | 38.36 |
| 89.50353291186315 | 2.131 | -3.282 | 38.451 | 38.67 |
| 89.6708813685385 | 2.075 | -3.277 | 38.6 | 38.814 |
| 89.83822982521386 | 2.006 | -3.249 | 38.428 | 38.639 |
| 90.00557828188919 | 1.969 | -3.267 | 38.226 | 38.437 |
| 90.16362960208257 | 1.948 | -3.298 | 38.08 | 38.294 |
| 90.3309780587579 | 2.003 | -3.295 | 38.4 | 38.614 |
| 90.49832651543326 | 2.004 | -3.304 | 38.749 | 38.963 |
| 90.66567497210859 | 1.968 | -3.307 | 38.87 | 39.083 |
| 90.83302342878395 | 1.948 | -3.276 | 38.705 | 38.914 |
| 91.00037188545929 | 1.938 | -3.254 | 38.515 | 38.723 |
| 91.16772034213463 | 1.895 | -3.252 | 38.276 | 38.484 |
| 91.33506879880998 | 1.873 | -3.255 | 38.218 | 38.425 |
| 91.50241725548533 | 1.881 | -3.248 | 38.224 | 38.429 |
| 91.66976571216065 | 1.901 | -3.271 | 38.556 | 38.763 |
| 91.83711416883601 | 1.895 | -3.308 | 38.83 | 39.038 |
| 92.00446262551137 | 1.847 | -3.319 | 38.796 | 39.007 |
| 92.1718110821867 | 1.83 | -3.294 | 38.546 | 38.757 |
| 92.33915953886203 | 1.851 | -3.273 | 38.434 | 38.643 |
| 92.49721085905541 | 1.923 | -3.254 | 38.568 | 38.776 |
| 92.66455931573077 | 1.962 | -3.249 | 38.779 | 38.987 |
| 92.83190777240611 | 1.931 | -3.235 | 38.606 | 38.813 |
| 92.99925622908145 | 1.883 | -3.263 | 38.291 | 38.499 |
| 93.1666046857568 | 1.91 | -3.232 | 38.133 | 38.338 |
| 93.33395314243214 | 1.929 | -3.212 | 38.294 | 38.496 |
| 93.50130159910749 | 1.956 | -3.19 | 38.614 | 38.816 |
| 93.66865005578283 | 1.926 | -3.235 | 38.743 | 38.947 |
| 93.83599851245818 | 1.882 | -3.209 | 38.549 | 38.751 |
| 94.00334696913353 | 1.857 | -3.233 | 38.317 | 38.521 |
| 94.17069542580886 | 1.886 | -3.218 | 38.165 | 38.37 |
| 94.3380438824842 | 1.917 | -3.208 | 38.304 | 38.506 |
| 94.50539233915954 | 1.944 | -3.177 | 38.656 | 38.857 |
| 94.66344365935292 | 1.912 | -3.211 | 38.732 | 38.934 |
| 94.83079211602828 | 1.892 | -3.205 | 38.448 | 38.652 |
| 94.99814057270362 | 1.907 | -3.211 | 38.254 | 38.459 |
| 95.16548902937897 | 1.954 | -3.211 | 38.503 | 38.711 |
| 95.33283748605432 | 1.916 | -3.239 | 38.726 | 38.931 |
| 95.50018594272963 | 1.857 | -3.245 | 38.681 | 38.885 |
| 95.66753439940499 | 1.788 | -3.258 | 38.388 | 38.591 |
| 95.83488285608034 | 1.752 | -3.282 | 38.201 | 38.404 |
| 96.00223131275567 | 1.783 | -3.271 | 38.279 | 38.484 |
| 96.16957976943102 | 1.788 | -3.279 | 38.546 | 38.751 |
| 96.33692822610638 | 1.77 | -3.292 | 38.645 | 38.85 |
| 96.50427668278171 | 1.742 | -3.305 | 38.357 | 38.563 |
| 96.67162513945706 | 1.73 | -3.291 | 37.944 | 38.152 |
| 96.8389735961324 | 1.761 | -3.313 | 37.879 | 38.09 |
| 96.99702491632577 | 1.788 | -3.32 | 38.255 | 38.465 |
| 97.16437337300111 | 1.782 | -3.322 | 38.417 | 38.627 |
| 97.33172182967647 | 1.765 | -3.329 | 38.386 | 38.596 |
| 97.49907028635181 | 1.723 | -3.336 | 38.301 | 38.512 |
| 97.66641874302715 | 1.717 | -3.316 | 38.086 | 38.295 |
| 97.8337671997025 | 1.779 | -3.294 | 38.364 | 38.572 |
| 98.00111565637785 | 1.832 | -3.282 | 38.78 | 38.987 |
| 98.16846411305319 | 1.817 | -3.298 | 38.892 | 39.097 |
| 98.33581256972855 | 1.773 | -3.296 | 38.754 | 38.959 |
| 98.50316102640389 | 1.782 | -3.285 | 38.701 | 38.906 |
| 98.67050948307921 | 1.81 | -3.273 | 38.835 | 39.038 |
| 98.83785793975456 | 1.841 | -3.263 | 39.19 | 39.392 |
| 99.0052063964299 | 1.85 | -3.295 | 39.683 | 39.885 |
| 99.17255485310525 | 1.848 | -3.316 | 39.904 | 40.108 |
| 99.33060617329863 | 1.845 | -3.313 | 39.858 | 40.063 |
| 99.49795462997399 | 1.83 | -3.292 | 39.529 | 39.735 |
| 99.66530308664933 | 1.854 | -3.286 | 39.55 | 39.754 |
| 99.83265154332467 | 1.855 | -3.288 | 39.532 | 39.736 |
| 100.0 | 1.881 | -3.255 | 39.335 | 39.538 |